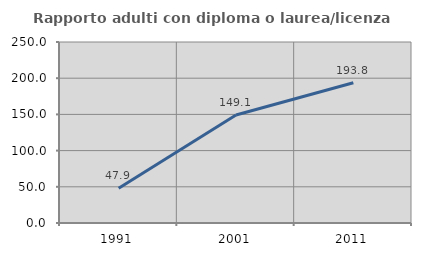
| Category | Rapporto adulti con diploma o laurea/licenza media  |
|---|---|
| 1991.0 | 47.887 |
| 2001.0 | 149.091 |
| 2011.0 | 193.75 |